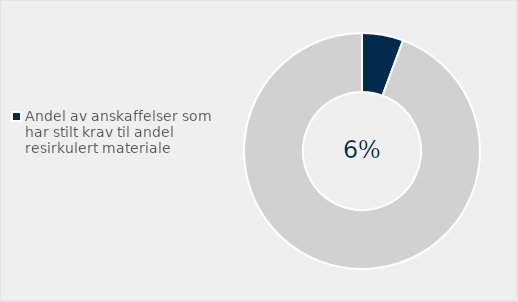
| Category | Series 0 |
|---|---|
| Andel av anskaffelser som har stilt krav til andel resirkulert materiale | 0.057 |
| Ikke stilt krav  | 0.943 |